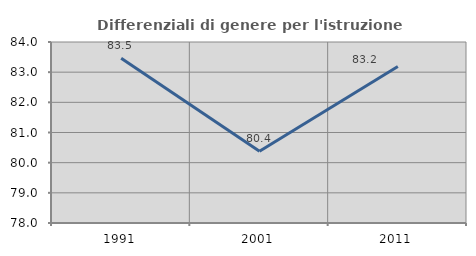
| Category | Differenziali di genere per l'istruzione superiore |
|---|---|
| 1991.0 | 83.465 |
| 2001.0 | 80.381 |
| 2011.0 | 83.188 |